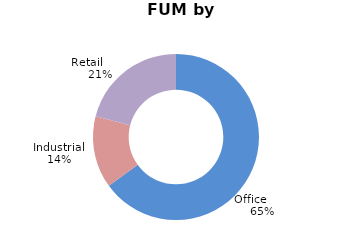
| Category | Series 0 |
|---|---|
| Office        | 0.65 |
| Industrial | 0.14 |
| Retail         | 0.21 |
| International | 0 |